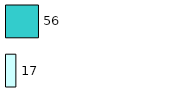
| Category | Series 0 | Series 1 |
|---|---|---|
| 0 | 17 | 56 |